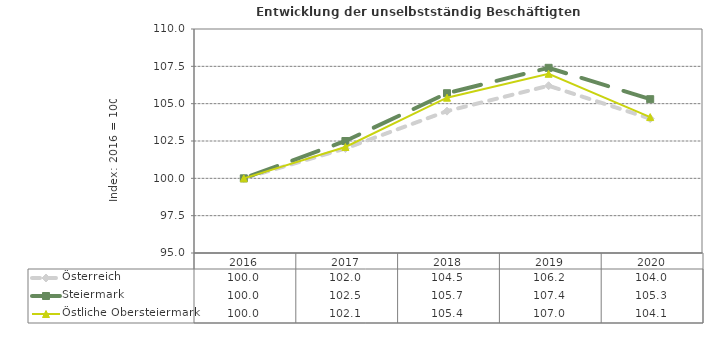
| Category | Österreich | Steiermark | Östliche Obersteiermark |
|---|---|---|---|
| 2020.0 | 104 | 105.3 | 104.1 |
| 2019.0 | 106.2 | 107.4 | 107 |
| 2018.0 | 104.5 | 105.7 | 105.4 |
| 2017.0 | 102 | 102.5 | 102.1 |
| 2016.0 | 100 | 100 | 100 |